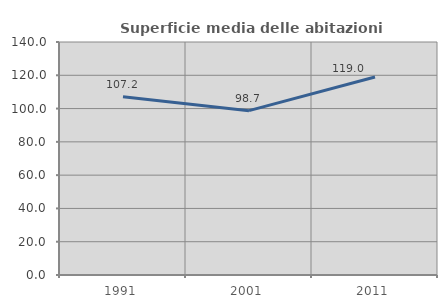
| Category | Superficie media delle abitazioni occupate |
|---|---|
| 1991.0 | 107.161 |
| 2001.0 | 98.744 |
| 2011.0 | 119.01 |